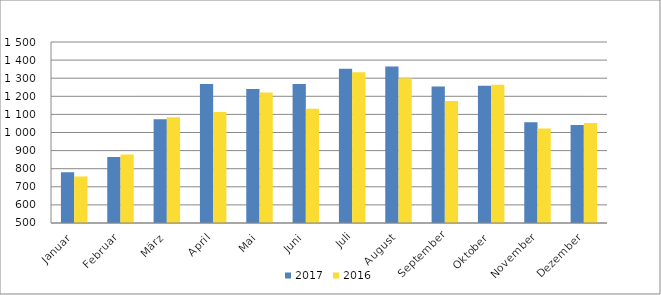
| Category | 2017 | 2016 |
|---|---|---|
| Januar | 780382 | 757110 |
| Februar | 865255 | 877769 |
| März | 1073065 | 1084943 |
| April | 1267940 | 1112867 |
| Mai | 1239911 | 1220765 |
| Juni | 1268497 | 1131610 |
| Juli | 1352242 | 1332715 |
| August | 1364292 | 1299892 |
| September | 1254235 | 1173878 |
| Oktober | 1258194 | 1264264 |
| November | 1057103 | 1022638 |
| Dezember | 1041221 | 1052550 |